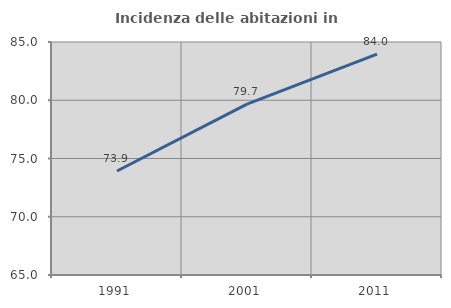
| Category | Incidenza delle abitazioni in proprietà  |
|---|---|
| 1991.0 | 73.924 |
| 2001.0 | 79.671 |
| 2011.0 | 83.951 |